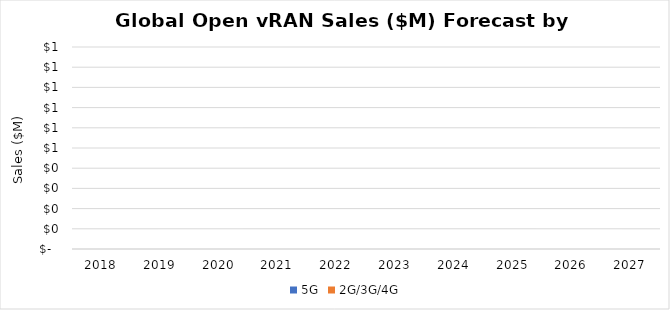
| Category | 5G | 2G/3G/4G |
|---|---|---|
| 2018.0 | 0 | 0 |
| 2019.0 | 0 | 0 |
| 2020.0 | 0 | 0 |
| 2021.0 | 0 | 0 |
| 2022.0 | 0 | 0 |
| 2023.0 | 0 | 0 |
| 2024.0 | 0 | 0 |
| 2025.0 | 0 | 0 |
| 2026.0 | 0 | 0 |
| 2027.0 | 0 | 0 |